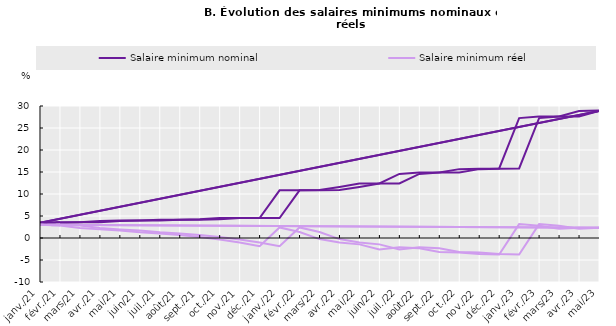
| Category | Salaire minimum nominal | Salaire minimum réel |
|---|---|---|
| 2021-02-01 | 3.446 | 3.009 |
| 2021-03-01 | 3.579 | 2.863 |
| 2021-04-01 | 3.579 | 2.266 |
| 2021-05-01 | 3.849 | 1.961 |
| 2021-06-01 | 3.978 | 1.704 |
| 2021-07-01 | 3.998 | 1.312 |
| 2021-08-01 | 4.148 | 1.044 |
| 2021-09-01 | 4.148 | 0.677 |
| 2021-10-01 | 4.269 | 0.25 |
| 2021-11-01 | 4.543 | -0.346 |
| 2021-12-01 | 4.543 | -1.038 |
| 2022-01-01 | 4.543 | -1.886 |
| 2022-02-01 | 10.832 | 2.408 |
| 2022-03-01 | 10.832 | 1.349 |
| 2022-04-01 | 10.902 | -0.246 |
| 2022-05-01 | 11.602 | -1.032 |
| 2022-06-01 | 12.371 | -1.447 |
| 2022-07-01 | 12.386 | -2.624 |
| 2022-08-01 | 14.553 | -2.097 |
| 2022-09-01 | 14.905 | -2.355 |
| 2022-10-01 | 14.905 | -3.195 |
| 2022-11-01 | 15.651 | -3.31 |
| 2022-12-01 | 15.728 | -3.638 |
| 2023-01-01 | 15.807 | -3.742 |
| 2023-02-01 | 27.251 | 3.153 |
| 2023-03-01 | 27.625 | 2.783 |
| 2023-04-01 | 27.625 | 2.089 |
| 2023-05-01 | 28.869 | 2.324 |
| 2021-01-01 | 3.446 | 3.009 |
| 2021-02-01 | 3.579 | 2.863 |
| 2021-03-01 | 3.579 | 2.266 |
| 2021-04-01 | 3.849 | 1.961 |
| 2021-05-01 | 3.978 | 1.704 |
| 2021-06-01 | 3.998 | 1.312 |
| 2021-07-01 | 4.148 | 1.044 |
| 2021-08-01 | 4.148 | 0.677 |
| 2021-09-01 | 4.269 | 0.25 |
| 2021-10-01 | 4.543 | -0.346 |
| 2021-11-01 | 4.543 | -1.038 |
| 2021-12-01 | 4.543 | -1.886 |
| 2022-01-01 | 10.832 | 2.408 |
| 2022-02-01 | 10.832 | 1.349 |
| 2022-03-01 | 10.902 | -0.246 |
| 2022-04-01 | 11.602 | -1.032 |
| 2022-05-01 | 12.371 | -1.447 |
| 2022-06-01 | 12.386 | -2.624 |
| 2022-07-01 | 14.553 | -2.097 |
| 2022-08-01 | 14.905 | -2.355 |
| 2022-09-01 | 14.905 | -3.195 |
| 2022-10-01 | 15.651 | -3.31 |
| 2022-11-01 | 15.728 | -3.638 |
| 2022-12-01 | 15.807 | -3.742 |
| 2023-01-01 | 27.251 | 3.153 |
| 2023-02-01 | 27.625 | 2.783 |
| 2023-03-01 | 27.625 | 2.089 |
| 2023-04-01 | 28.869 | 2.324 |
| 2023-05-01 | 29.005 | 2.308 |